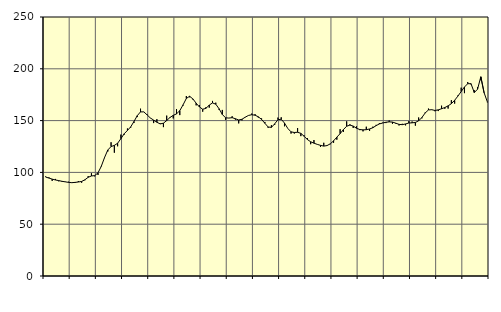
| Category | Piggar | Series 1 |
|---|---|---|
| nan | 96.1 | 95.5 |
| 87.0 | 95.2 | 94.53 |
| 87.0 | 91.8 | 93.51 |
| 87.0 | 93.7 | 92.68 |
| nan | 91.4 | 92.09 |
| 88.0 | 91 | 91.41 |
| 88.0 | 91.1 | 90.87 |
| 88.0 | 91 | 90.38 |
| nan | 90.3 | 90.08 |
| 89.0 | 89.8 | 90.36 |
| 89.0 | 91.6 | 90.73 |
| 89.0 | 90 | 91.27 |
| nan | 92.4 | 92.88 |
| 90.0 | 96.4 | 95.27 |
| 90.0 | 99.2 | 96.56 |
| 90.0 | 96.2 | 96.9 |
| nan | 97.5 | 99.55 |
| 91.0 | 106.2 | 105.83 |
| 91.0 | 113.8 | 114.34 |
| 91.0 | 120.2 | 121.65 |
| nan | 129.1 | 124.95 |
| 92.0 | 119 | 126.06 |
| 92.0 | 125.2 | 128.13 |
| 92.0 | 136.5 | 132.57 |
| nan | 136.4 | 137.27 |
| 93.0 | 142.4 | 140.51 |
| 93.0 | 143.2 | 143.98 |
| 93.0 | 147.7 | 149.12 |
| nan | 153.4 | 154.76 |
| 94.0 | 161.5 | 158.43 |
| 94.0 | 158.3 | 158.4 |
| 94.0 | 156.1 | 155.55 |
| nan | 152.4 | 152.54 |
| 95.0 | 147.6 | 150.48 |
| 95.0 | 151.4 | 148.42 |
| 95.0 | 147.3 | 146.8 |
| nan | 143.7 | 147.49 |
| 96.0 | 154.8 | 150.05 |
| 96.0 | 152.7 | 153.02 |
| 96.0 | 152.1 | 155.06 |
| nan | 161.1 | 156.48 |
| 97.0 | 155.3 | 159.59 |
| 97.0 | 164.5 | 165.21 |
| 97.0 | 173.7 | 171.36 |
| nan | 172.5 | 173.48 |
| 98.0 | 170.4 | 170.95 |
| 98.0 | 164.7 | 166.81 |
| 98.0 | 165 | 163.16 |
| nan | 158.6 | 160.98 |
| 99.0 | 163 | 161.79 |
| 99.0 | 162.5 | 165.01 |
| 99.0 | 169 | 167.05 |
| nan | 167.3 | 165.85 |
| 0.0 | 160.4 | 161.45 |
| 0.0 | 160.3 | 155.91 |
| 0.0 | 150.7 | 152.69 |
| nan | 152.5 | 152.46 |
| 1.0 | 154.2 | 152.82 |
| 1.0 | 150.9 | 151.81 |
| 1.0 | 147.3 | 150.58 |
| nan | 150.2 | 151.28 |
| 2.0 | 153.5 | 153.28 |
| 2.0 | 154.9 | 154.99 |
| 2.0 | 156.8 | 155.65 |
| nan | 156.2 | 155.21 |
| 3.0 | 152.9 | 153.66 |
| 3.0 | 152.1 | 151.13 |
| 3.0 | 148.7 | 147.42 |
| nan | 143 | 143.83 |
| 4.0 | 145.6 | 143.45 |
| 4.0 | 145.8 | 146.86 |
| 4.0 | 152.9 | 150.81 |
| nan | 153.2 | 151.33 |
| 5.0 | 144.5 | 147.61 |
| 5.0 | 142.5 | 142.45 |
| 5.0 | 137.5 | 139.13 |
| nan | 137.5 | 138.54 |
| 6.0 | 142.8 | 138.74 |
| 6.0 | 135 | 137.67 |
| 6.0 | 135.7 | 134.88 |
| nan | 133.1 | 131.7 |
| 7.0 | 127.2 | 129.56 |
| 7.0 | 131.2 | 128.21 |
| 7.0 | 127.1 | 127.08 |
| nan | 124.6 | 126.09 |
| 8.0 | 128.6 | 125.39 |
| 8.0 | 126.1 | 125.88 |
| 8.0 | 127.2 | 127.59 |
| nan | 128.6 | 130.44 |
| 9.0 | 131.6 | 134.05 |
| 9.0 | 141.7 | 137.4 |
| 9.0 | 139.1 | 141.31 |
| nan | 149.3 | 144.55 |
| 10.0 | 146.4 | 145.66 |
| 10.0 | 142.9 | 144.7 |
| 10.0 | 144.5 | 142.64 |
| nan | 140.8 | 141.38 |
| 11.0 | 139.6 | 141.06 |
| 11.0 | 144.1 | 141.22 |
| 11.0 | 140.1 | 141.92 |
| nan | 144.1 | 143.11 |
| 12.0 | 145.9 | 145.12 |
| 12.0 | 147.6 | 146.8 |
| 12.0 | 148 | 147.65 |
| nan | 147.6 | 148.42 |
| 13.0 | 150.1 | 148.78 |
| 13.0 | 146.9 | 148.56 |
| 13.0 | 147.1 | 147.52 |
| nan | 145.3 | 146.36 |
| 14.0 | 146.9 | 146.08 |
| 14.0 | 145.4 | 146.77 |
| 14.0 | 149.5 | 147.64 |
| nan | 149.1 | 147.85 |
| 15.0 | 145.1 | 148.2 |
| 15.0 | 153 | 149.79 |
| 15.0 | 152.2 | 153.03 |
| nan | 157.9 | 157.37 |
| 16.0 | 161.6 | 160.29 |
| 16.0 | 160.7 | 160.51 |
| 16.0 | 159 | 159.79 |
| nan | 159.2 | 160.38 |
| 17.0 | 164.4 | 161.45 |
| 17.0 | 161.4 | 162.59 |
| 17.0 | 161.6 | 164.23 |
| nan | 169.7 | 166.33 |
| 18.0 | 166.4 | 169.64 |
| 18.0 | 174.2 | 173.65 |
| 18.0 | 181.8 | 178.05 |
| nan | 176.5 | 182.42 |
| 19.0 | 187.2 | 185.61 |
| 19.0 | 185 | 185.62 |
| 19.0 | 179.3 | 177.05 |
| nan | 182.3 | 180.31 |
| 20.0 | 188.9 | 192.28 |
| 20.0 | 176.6 | 176.95 |
| 20.0 | 167.6 | 168.04 |